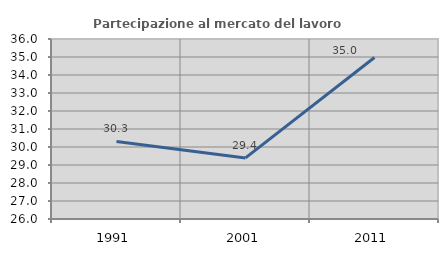
| Category | Partecipazione al mercato del lavoro  femminile |
|---|---|
| 1991.0 | 30.31 |
| 2001.0 | 29.394 |
| 2011.0 | 34.974 |